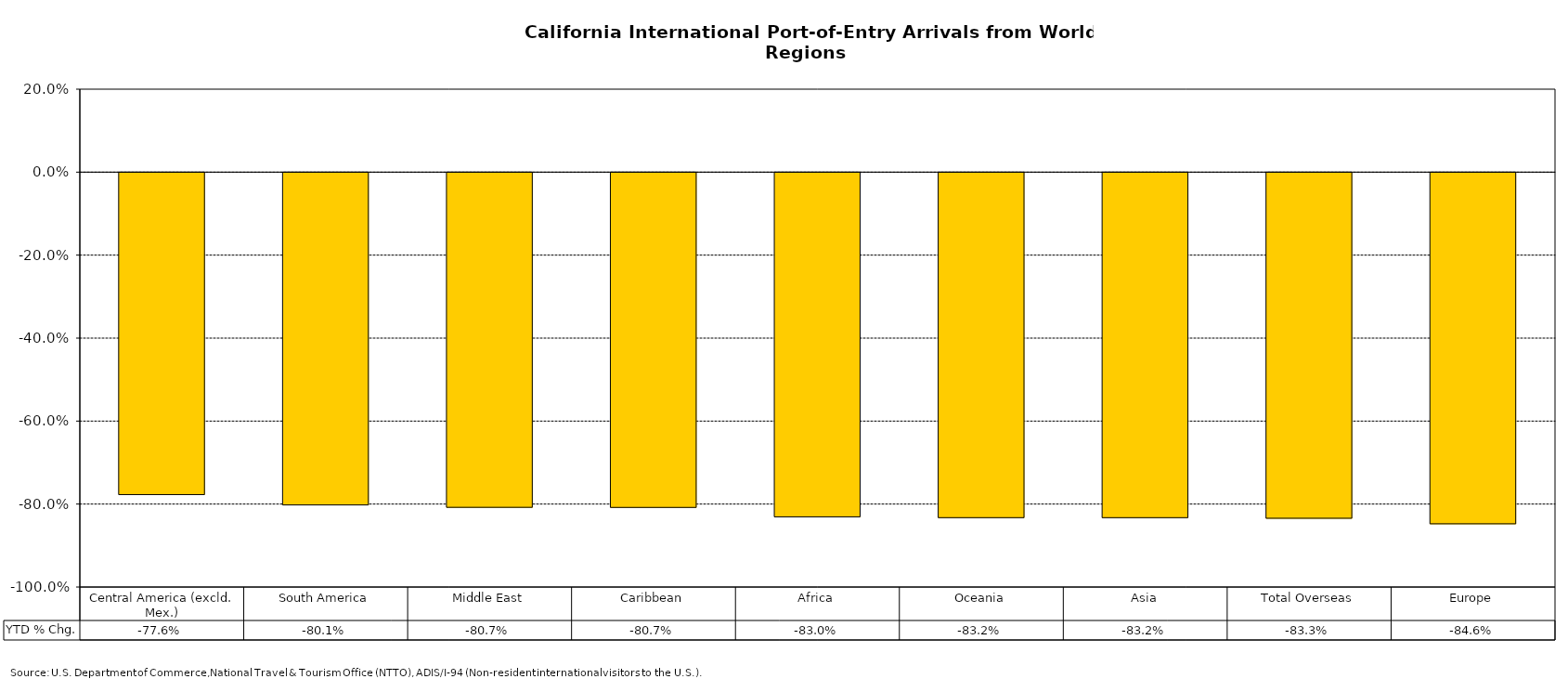
| Category | YTD % Chg. |
|---|---|
| Central America (excld. Mex.) | -0.776 |
| South America | -0.801 |
| Middle East | -0.807 |
| Caribbean | -0.807 |
| Africa | -0.83 |
| Oceania | -0.832 |
| Asia | -0.832 |
| Total Overseas | -0.833 |
| Europe | -0.846 |